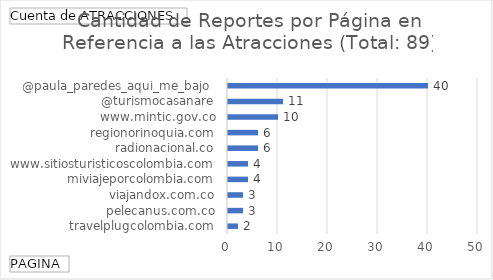
| Category | Total |
|---|---|
| travelplugcolombia.com | 2 |
| pelecanus.com.co | 3 |
| viajandox.com.co | 3 |
| miviajeporcolombia.com | 4 |
| www.sitiosturisticoscolombia.com | 4 |
| radionacional.co | 6 |
| regionorinoquia.com | 6 |
| www.mintic.gov.co | 10 |
| @turismocasanare | 11 |
| @paula_paredes_aqui_me_bajo  | 40 |